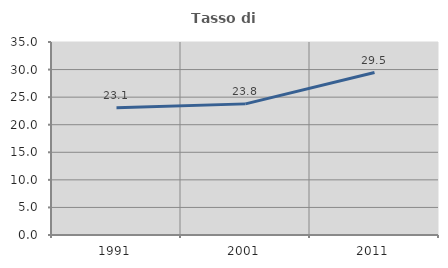
| Category | Tasso di occupazione   |
|---|---|
| 1991.0 | 23.074 |
| 2001.0 | 23.779 |
| 2011.0 | 29.464 |